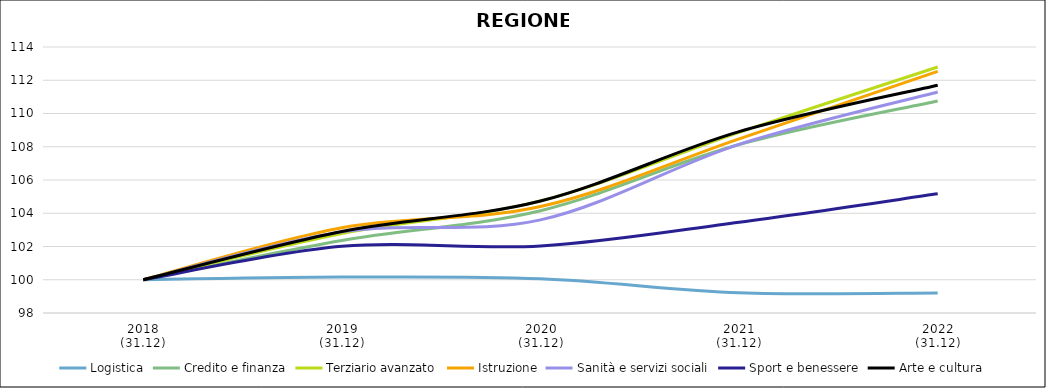
| Category | Logistica | Credito e finanza | Terziario avanzato | Istruzione | Sanità e servizi sociali | Sport e benessere | Arte e cultura |
|---|---|---|---|---|---|---|---|
| 2018
(31.12) | 100 | 100 | 100 | 100 | 100 | 100 | 100 |
| 2019
(31.12) | 100.162 | 102.363 | 102.786 | 103.128 | 102.88 | 102.011 | 102.904 |
| 2020
(31.12) | 100.06 | 104.153 | 104.743 | 104.401 | 103.602 | 102.036 | 104.736 |
| 2021
(31.12) | 99.22 | 108.132 | 108.868 | 108.469 | 108.144 | 103.462 | 108.909 |
| 2022
(31.12) | 99.202 | 110.752 | 112.795 | 112.538 | 111.292 | 105.169 | 111.7 |